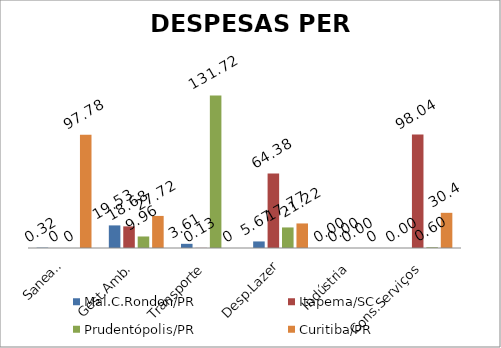
| Category | Mal.C.Rondon/PR | Itapema/SC | Prudentópolis/PR | Toledo/PR | Cascavel/PR | Curitiba/PR |
|---|---|---|---|---|---|---|
| Saneam. | 0.32 | 0 | 0 |  |  | 97.78 |
| Gest.Amb. | 19.53 | 18.68 | 9.96 |  |  | 27.72 |
| Transporte | 3.61 | 0.13 | 131.72 |  |  | 0 |
| Desp.Lazer | 5.67 | 64.38 | 17.77 |  |  | 21.22 |
| Indústria | 0 | 0 | 0 |  |  | 0 |
| Cons.Serviços | 0 | 98.04 | 0.6 |  |  | 30.4 |